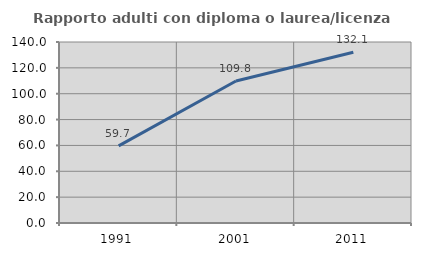
| Category | Rapporto adulti con diploma o laurea/licenza media  |
|---|---|
| 1991.0 | 59.701 |
| 2001.0 | 109.804 |
| 2011.0 | 132.065 |